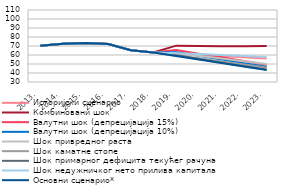
| Category | Историјски сценарио | Комбиновани шок | Валутни шок (депрецијација 15%) | Валутни шок (депрецијација 10%) | Шок привредног раста | Шок каматне стопе | Шок примарног дефицита текућег рачуна | Шок недужничког нето прилива капитала | Основни сценарио* |
|---|---|---|---|---|---|---|---|---|---|
| 2013. | 70.405 | 70.405 | 70.405 | 70.405 | 70.405 | 70.405 | 70.405 | 70.405 | 70.405 |
| 2014. | 72.402 | 72.402 | 72.402 | 72.402 | 72.402 | 72.402 | 72.402 | 72.402 | 72.402 |
| 2015. | 73.452 | 73.452 | 73.452 | 73.452 | 73.452 | 73.452 | 73.452 | 73.452 | 73.452 |
| 2016. | 72.149 | 72.149 | 72.149 | 72.149 | 72.149 | 72.149 | 72.149 | 72.149 | 72.149 |
| 2017. | 65.225 | 65.225 | 65.225 | 65.225 | 65.225 | 65.225 | 65.225 | 65.225 | 65.225 |
| 2018. | 62.88 | 62.88 | 62.88 | 62.88 | 62.88 | 62.88 | 62.88 | 62.88 | 62.88 |
| 2019. | 61.518 | 70.395 | 65.487 | 63.016 | 61.763 | 59.448 | 60.056 | 62.03 | 58.83 |
| 2020. | 60.154 | 69.943 | 61.503 | 59.112 | 59.071 | 56.341 | 55.705 | 61.058 | 55.062 |
| 2021. | 58.789 | 69.8 | 57.377 | 55.054 | 56.14 | 52.916 | 51.532 | 60.045 | 51.118 |
| 2022. | 57.423 | 69.64 | 53.227 | 50.971 | 53.095 | 49.497 | 47.463 | 58.919 | 47.147 |
| 2023. | 56.056 | 69.904 | 49.204 | 46.998 | 50.092 | 46.007 | 43.792 | 57.868 | 43.261 |